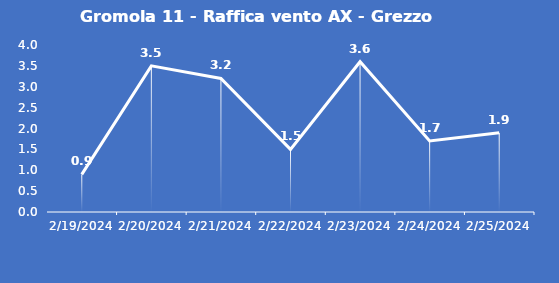
| Category | Gromola 11 - Raffica vento AX - Grezzo (m/s) |
|---|---|
| 2/19/24 | 0.9 |
| 2/20/24 | 3.5 |
| 2/21/24 | 3.2 |
| 2/22/24 | 1.5 |
| 2/23/24 | 3.6 |
| 2/24/24 | 1.7 |
| 2/25/24 | 1.9 |